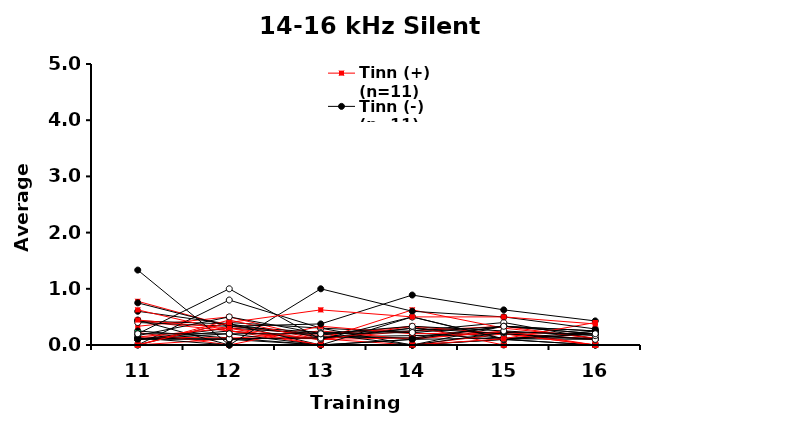
| Category | Tinn (+) (n=11) | Tinn (-) (n=11) | Ctrl (n=8) | CI03 | CI04 | CI05 | CI06 | CI07 | CI08 | CI09 | CI10 | DS18 | CI11 | CI12 | DS19 | CI13 | CI14 | DS20 | CI15 | CI16 | DS21 | CI17 | CI18 | DS22 | CI19 | CI20 | DS23 | CI21 | CI22 | DS24 |
|---|---|---|---|---|---|---|---|---|---|---|---|---|---|---|---|---|---|---|---|---|---|---|---|---|---|---|---|---|---|---|
| 11.0 | 0.333 | 0.25 | 0.1 | 0 | 0.125 | 0.778 | 0 | 0.143 | 0.111 | 0.429 | 0.429 | 0 | 0.444 | 0.222 | 0.1 | 0.6 | 0.625 | 0.4 | 0 | 0.444 | 0.2 | 1.333 | 0.75 | 0.1 | 0.1 | 0.143 | 0.167 | 0.125 | 0 | 0.2 |
| 12.0 | 0.5 | 0.125 | 0.25 | 0.4 | 0.1 | 0.333 | 0.111 | 0.125 | 0.1 | 0.25 | 0.375 | 0.8 | 0 | 0 | 0.3 | 0.375 | 0.25 | 0.333 | 0.444 | 0.3 | 1 | 0 | 0.333 | 0.111 | 0.2 | 0.3 | 0.5 | 0 | 0.4 | 0.2 |
| 13.0 | 0.111 | 0 | 0.1 | 0.3 | 0.143 | 0.167 | 0.25 | 0.111 | 0 | 0.1 | 0.143 | 0.3 | 0 | 0.333 | 0.2 | 0 | 0 | 0.222 | 0.091 | 0.1 | 0.1 | 0 | 0.375 | 0.125 | 0 | 0 | 0.2 | 1 | 0.625 | 0.2 |
| 14.0 | 0.25 | 0 | 0.3 | 0 | 0.167 | 0.333 | 0.1 | 0 | 0 | 0.125 | 0.125 | 0.222 | 0.5 | 0.2 | 0 | 0.1 | 0 | 0.25 | 0.333 | 0.625 | 0.5 | 0.1 | 0.889 | 0.3 | 0 | 0 | 0.333 | 0.6 | 0.5 | 0.222 |
| 15.0 | 0.333 | 0.333 | 0.111 | 0 | 0.2 | 0 | 0.25 | 0 | 0.1 | 0.222 | 0.333 | 0.091 | 0.1 | 0.222 | 0.1 | 0.125 | 0.2 | 0.4 | 0.2 | 0.3 | 0.111 | 0.333 | 0.625 | 0.2 | 0.222 | 0.111 | 0.25 | 0.5 | 0.5 | 0.333 |
| 16.0 | 0.111 | 0.25 | 0.1 | 0 | 0.1 | 0 | 0 | 0 | 0 | 0.1 | 0.2 | 0.2 | 0.25 | 0.2 | 0 | 0.125 | 0 | 0.111 | 0 | 0.125 | 0.2 | 0.25 | 0.429 | 0.1 | 0.2 | 0.4 | 0.167 | 0.286 | 0.375 | 0.2 |